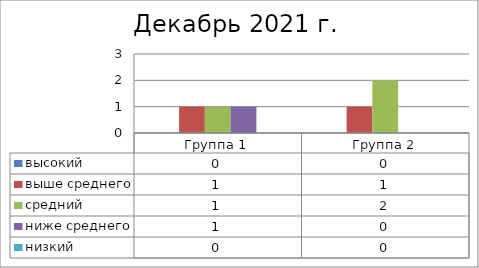
| Category | высокий | выше среднего | средний | ниже среднего | низкий |
|---|---|---|---|---|---|
| Группа 1 | 0 | 1 | 1 | 1 | 0 |
| Группа 2 | 0 | 1 | 2 | 0 | 0 |